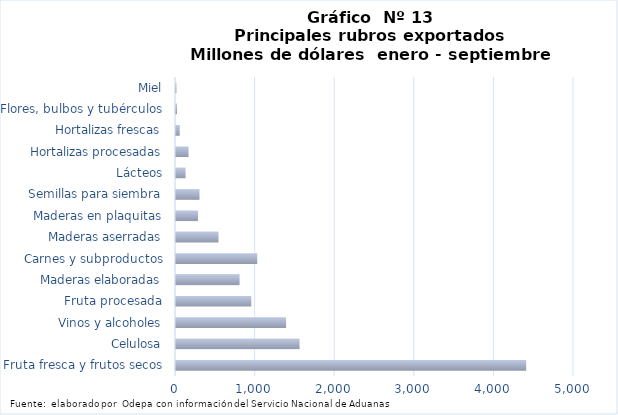
| Category | Series 7 |
|---|---|
| Fruta fresca y frutos secos | 4399399.683 |
| Celulosa | 1552249.185 |
| Vinos y alcoholes | 1383264.855 |
| Fruta procesada | 945786.553 |
| Maderas elaboradas | 798649.896 |
| Carnes y subproductos | 1020722.856 |
| Maderas aserradas | 533998.914 |
| Maderas en plaquitas | 276267.039 |
| Semillas para siembra | 294961.003 |
| Lácteos | 120451.443 |
| Hortalizas procesadas | 157457.393 |
| Hortalizas frescas | 47238.279 |
| Flores, bulbos y tubérculos | 13364.582 |
| Miel | 5572.892 |